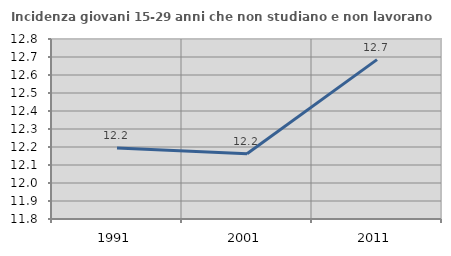
| Category | Incidenza giovani 15-29 anni che non studiano e non lavorano  |
|---|---|
| 1991.0 | 12.195 |
| 2001.0 | 12.162 |
| 2011.0 | 12.685 |